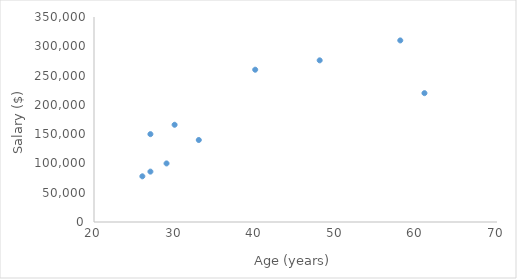
| Category | Series 0 |
|---|---|
| 30.0 | 166000 |
| 26.0 | 78000 |
| 58.0 | 310000 |
| 29.0 | 100000 |
| 40.0 | 260000 |
| 27.0 | 150000 |
| 33.0 | 140000 |
| 61.0 | 220000 |
| 27.0 | 86000 |
| 48.0 | 276000 |